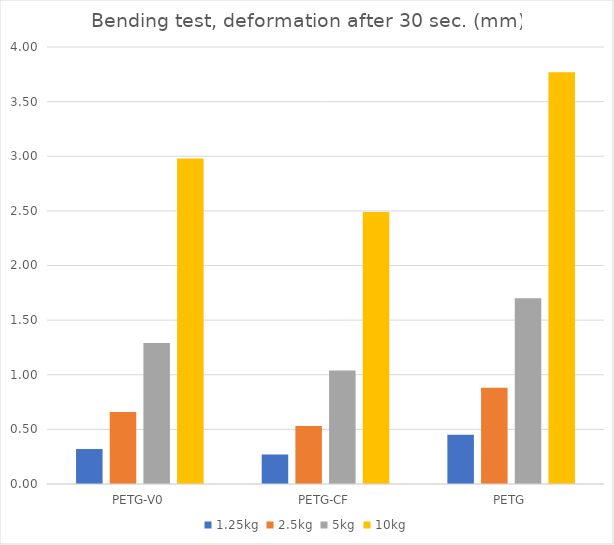
| Category | 1.25kg | 2.5kg | 5kg | 10kg |
|---|---|---|---|---|
| PETG-V0 | 0.32 | 0.66 | 1.29 | 2.98 |
| PETG-CF | 0.27 | 0.53 | 1.04 | 2.49 |
| PETG | 0.45 | 0.88 | 1.7 | 3.77 |